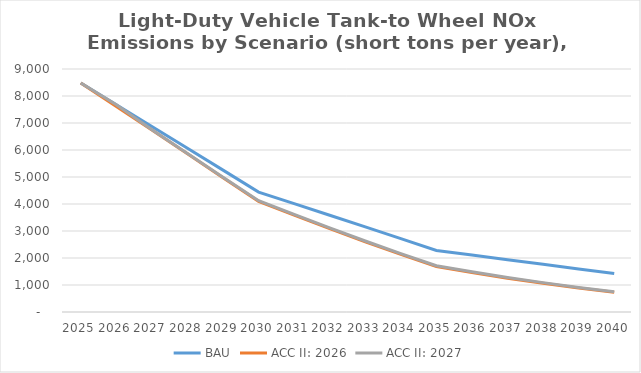
| Category | BAU | ACC II: 2026 | ACC II: 2027 |
|---|---|---|---|
| 2025.0 | 8479.979 | 8479.979 | 8479.979 |
| 2026.0 | 7672.598 | 7614.575 | 7672.598 |
| 2027.0 | 6868.167 | 6737.044 | 6746.545 |
| 2028.0 | 6062.294 | 5858.798 | 5873.109 |
| 2029.0 | 5254.162 | 4975.319 | 4994.325 |
| 2030.0 | 4441.875 | 4100.43 | 4122.861 |
| 2031.0 | 4012.694 | 3588.492 | 3615.17 |
| 2032.0 | 3582.267 | 3084.478 | 3114.285 |
| 2033.0 | 3151.372 | 2597.223 | 2628.603 |
| 2034.0 | 2720.279 | 2131.103 | 2162.435 |
| 2035.0 | 2280.563 | 1685.507 | 1715.016 |
| 2036.0 | 2108.795 | 1460.683 | 1490.441 |
| 2037.0 | 1936.957 | 1252.439 | 1281.338 |
| 2038.0 | 1765.225 | 1060.906 | 1088.058 |
| 2039.0 | 1594.382 | 886.492 | 910.915 |
| 2040.0 | 1424.122 | 731.133 | 752.009 |